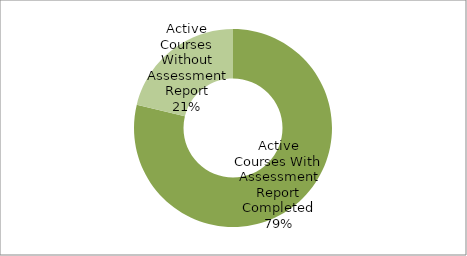
| Category | Series 0 |
|---|---|
| Active Courses With Assessment Report Completed | 401 |
| Active Courses Without Assessment Report | 108 |